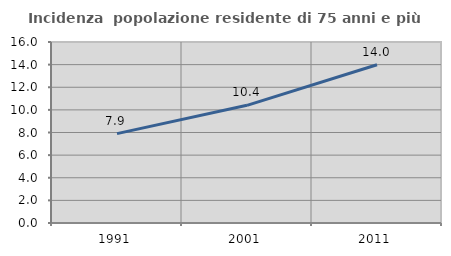
| Category | Incidenza  popolazione residente di 75 anni e più |
|---|---|
| 1991.0 | 7.898 |
| 2001.0 | 10.402 |
| 2011.0 | 13.987 |